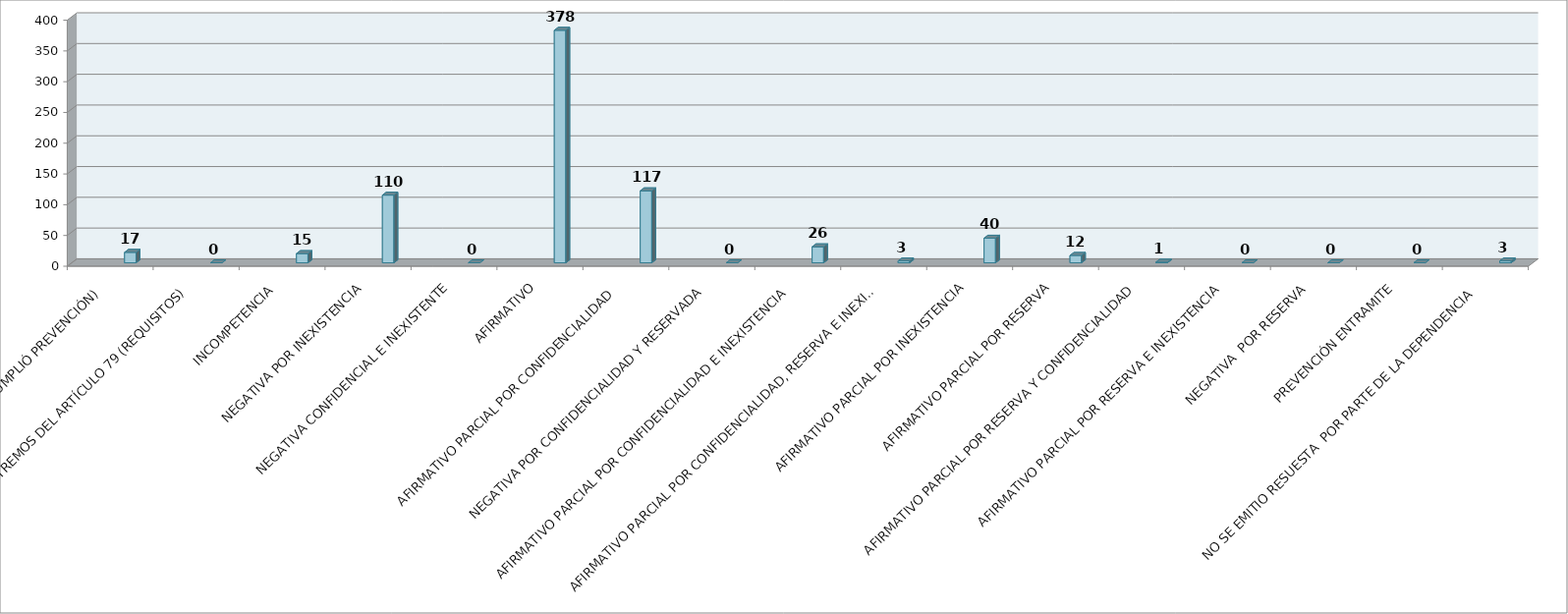
| Category | Series 0 | Series 1 | Series 2 | Series 3 | Series 4 | Series 5 |
|---|---|---|---|---|---|---|
| SE TIENE POR NO PRESENTADA ( NO CUMPLIÓ PREVENCIÓN) |  |  |  |  | 17 |  |
| NO CUMPLIO CON LOS EXTREMOS DEL ARTÍCULO 79 (REQUISITOS) |  |  |  |  | 0 |  |
| INCOMPETENCIA  |  |  |  |  | 15 |  |
| NEGATIVA POR INEXISTENCIA |  |  |  |  | 110 |  |
| NEGATIVA CONFIDENCIAL E INEXISTENTE |  |  |  |  | 0 |  |
| AFIRMATIVO |  |  |  |  | 378 |  |
| AFIRMATIVO PARCIAL POR CONFIDENCIALIDAD  |  |  |  |  | 117 |  |
| NEGATIVA POR CONFIDENCIALIDAD Y RESERVADA |  |  |  |  | 0 |  |
| AFIRMATIVO PARCIAL POR CONFIDENCIALIDAD E INEXISTENCIA |  |  |  |  | 26 |  |
| AFIRMATIVO PARCIAL POR CONFIDENCIALIDAD, RESERVA E INEXISTENCIA |  |  |  |  | 3 |  |
| AFIRMATIVO PARCIAL POR INEXISTENCIA |  |  |  |  | 40 |  |
| AFIRMATIVO PARCIAL POR RESERVA |  |  |  |  | 12 |  |
| AFIRMATIVO PARCIAL POR RESERVA Y CONFIDENCIALIDAD |  |  |  |  | 1 |  |
| AFIRMATIVO PARCIAL POR RESERVA E INEXISTENCIA |  |  |  |  | 0 |  |
| NEGATIVA  POR RESERVA |  |  |  |  | 0 |  |
| PREVENCIÓN ENTRAMITE |  |  |  |  | 0 |  |
| NO SE EMITIO RESUESTA  POR PARTE DE LA DEPENDENCIA |  |  |  |  | 3 |  |